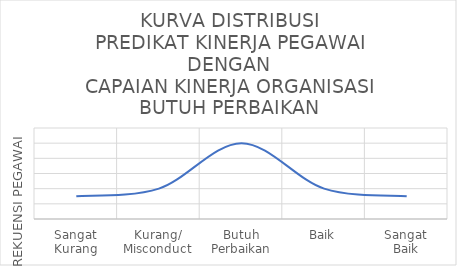
| Category | KURVA DISTRIBUSI
PREDIKAT KINERJA PEGAWAI DENGAN
CAPAIAN KINERJA ORGANISASI BUTUH PERBAIKAN |
|---|---|
| Sangat
Kurang | 3 |
| Kurang/
Misconduct | 4 |
| Butuh
Perbaikan | 10 |
| Baik | 4 |
| Sangat
Baik | 3 |